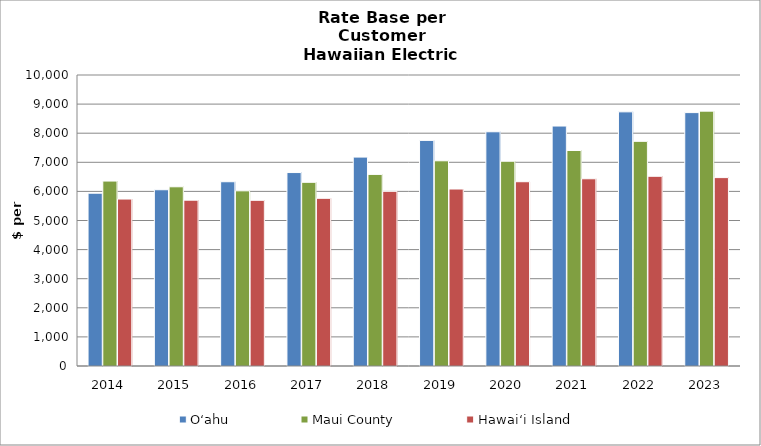
| Category | Oʻahu | Maui County | Hawai‘i Island |
|---|---|---|---|
| 2014.0 | 5938.375 | 6354.873 | 5736.901 |
| 2015.0 | 6057.087 | 6158.309 | 5698.229 |
| 2016.0 | 6331.646 | 6019.951 | 5693.305 |
| 2017.0 | 6647.553 | 6312.115 | 5761.944 |
| 2018.0 | 7178.671 | 6584.57 | 6002.962 |
| 2019.0 | 7753.173 | 7051.791 | 6081.466 |
| 2020.0 | 8049.135 | 7036.437 | 6332.589 |
| 2021.0 | 8245.947 | 7405.527 | 6433.844 |
| 2022.0 | 8733.619 | 7720.395 | 6519.542 |
| 2023.0 | 8707.704 | 8758.238 | 6473.999 |